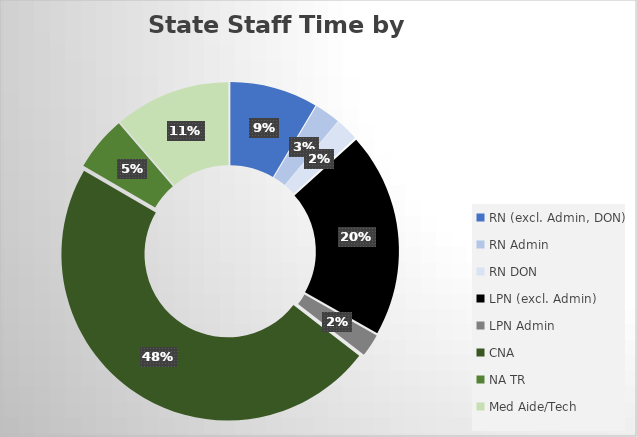
| Category | Series 0 |
|---|---|
| RN (excl. Admin, DON) | 8850.053 |
| RN Admin | 2606.942 |
| RN DON | 2315.388 |
| LPN (excl. Admin) | 20595.895 |
| LPN Admin | 2303.724 |
| CNA | 49577.525 |
| NA TR | 5519.311 |
| Med Aide/Tech | 11667.901 |